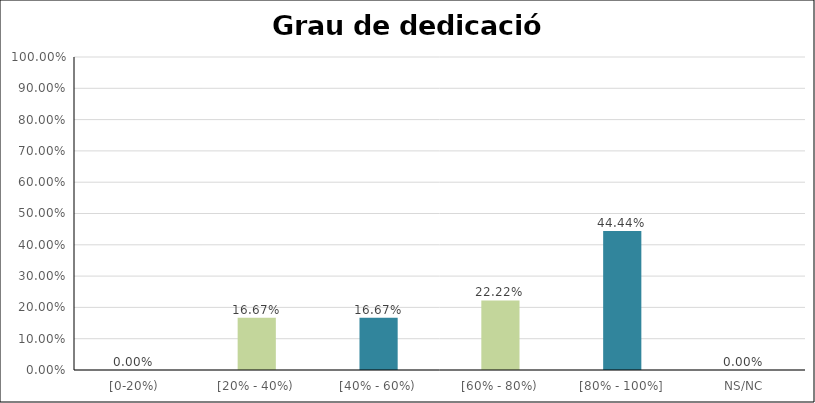
| Category | Series 0 |
|---|---|
| [0-20%) | 0 |
| [20% - 40%) | 0.167 |
| [40% - 60%) | 0.167 |
| [60% - 80%) | 0.222 |
| [80% - 100%] | 0.444 |
| NS/NC | 0 |